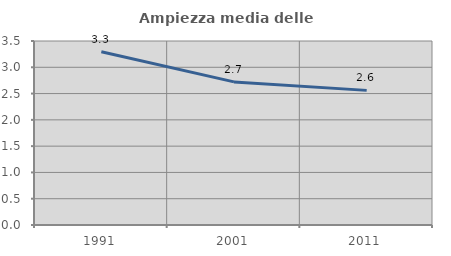
| Category | Ampiezza media delle famiglie |
|---|---|
| 1991.0 | 3.294 |
| 2001.0 | 2.722 |
| 2011.0 | 2.561 |